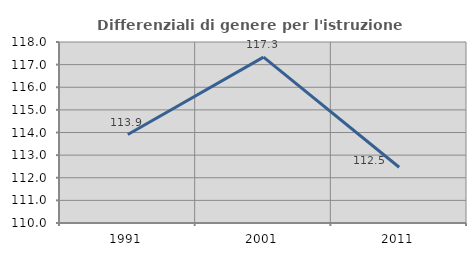
| Category | Differenziali di genere per l'istruzione superiore |
|---|---|
| 1991.0 | 113.911 |
| 2001.0 | 117.333 |
| 2011.0 | 112.464 |